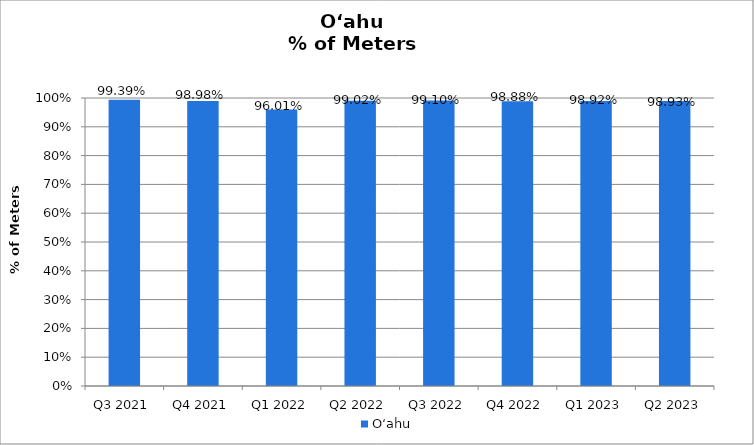
| Category | O‘ahu |
|---|---|
| Q3 2021 | 0.994 |
| Q4 2021 | 0.99 |
| Q1 2022 | 0.96 |
| Q2 2022 | 0.99 |
| Q3 2022 | 0.991 |
| Q4 2022 | 0.989 |
| Q1 2023 | 0.989 |
| Q2 2023 | 0.989 |